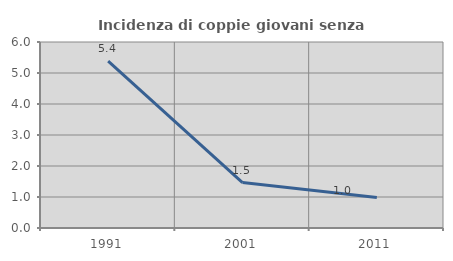
| Category | Incidenza di coppie giovani senza figli |
|---|---|
| 1991.0 | 5.385 |
| 2001.0 | 1.466 |
| 2011.0 | 0.984 |